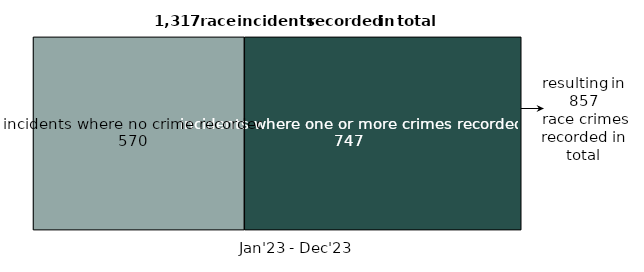
| Category | incidents where one or more crimes recorded | incidents where no crime recorded |
|---|---|---|
| Jan'23-Dec'23 | 747 | 570 |